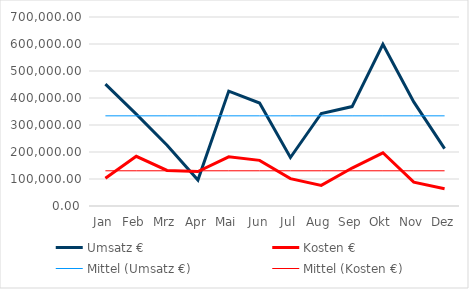
| Category | Umsatz € | Kosten € | Mittel (Umsatz €) | Mittel (Kosten €) |
|---|---|---|---|---|
| Jan | 451115 | 102572 | 333952.75 | 130438.917 |
| Feb | 340468 | 183984 | 333952.75 | 130438.917 |
| Mrz | 225092 | 131785 | 333952.75 | 130438.917 |
| Apr | 95930 | 127807 | 333952.75 | 130438.917 |
| Mai | 425584 | 182321 | 333952.75 | 130438.917 |
| Jun | 381424 | 169029 | 333952.75 | 130438.917 |
| Jul | 179572 | 101278 | 333952.75 | 130438.917 |
| Aug | 342665 | 76407 | 333952.75 | 130438.917 |
| Sep | 368212 | 140555 | 333952.75 | 130438.917 |
| Okt | 598916 | 197086 | 333952.75 | 130438.917 |
| Nov | 385706 | 88524 | 333952.75 | 130438.917 |
| Dez | 212749 | 63919 | 333952.75 | 130438.917 |